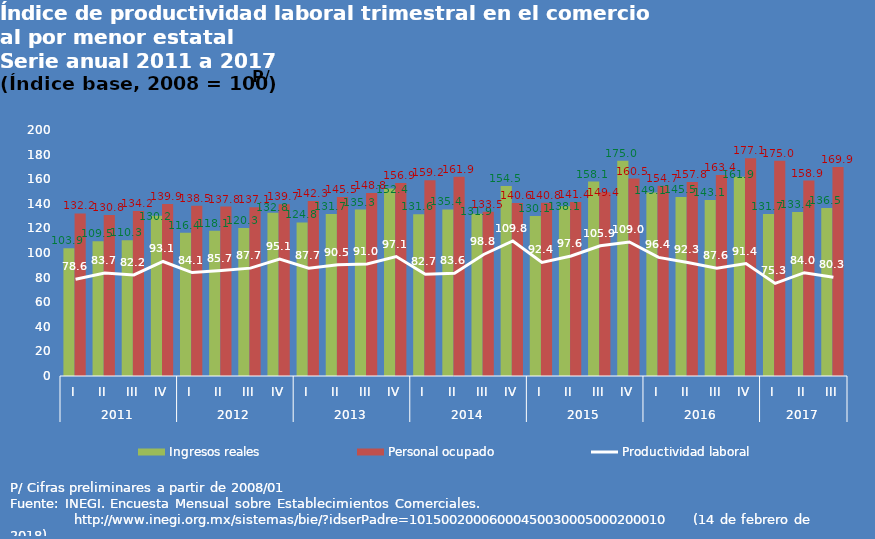
| Category | Ingresos reales | Personal ocupado |
|---|---|---|
| 0 | 103.9 | 132.2 |
| 1 | 109.5 | 130.8 |
| 2 | 110.3 | 134.2 |
| 3 | 130.2 | 139.9 |
| 4 | 116.4 | 138.5 |
| 5 | 118.1 | 137.8 |
| 6 | 120.3 | 137.1 |
| 7 | 132.8 | 139.7 |
| 8 | 124.8 | 142.3 |
| 9 | 131.7 | 145.5 |
| 10 | 135.3 | 148.8 |
| 11 | 152.4 | 156.9 |
| 12 | 131.6 | 159.2 |
| 13 | 135.4 | 161.9 |
| 14 | 131.9 | 133.5 |
| 15 | 154.5 | 140.6 |
| 16 | 130.1 | 140.8 |
| 17 | 138.1 | 141.4 |
| 18 | 158.1 | 149.4 |
| 19 | 175 | 160.5 |
| 20 | 149.1 | 154.7 |
| 21 | 145.5 | 157.8 |
| 22 | 143.1 | 163.4 |
| 23 | 161.9 | 177.1 |
| 24 | 131.7 | 175 |
| 25 | 133.4 | 158.9 |
| 26 | 136.5 | 169.9 |